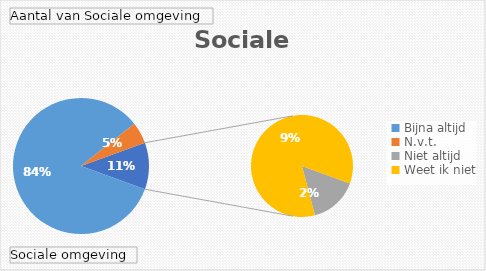
| Category | Totaal |
|---|---|
| Bijna altijd | 98 |
| N.v.t. | 6 |
| Niet altijd | 2 |
| Weet ik niet | 11 |